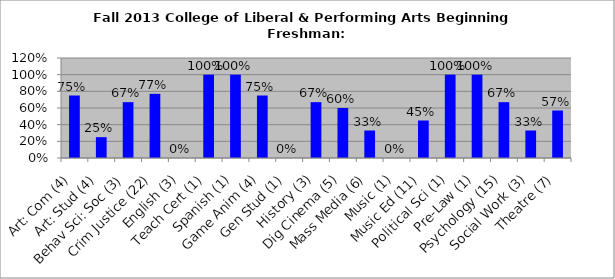
| Category | Series 0 |
|---|---|
| Art: Com (4) | 0.75 |
| Art: Stud (4) | 0.25 |
| Behav Sci: Soc (3) | 0.67 |
| Crim Justice (22) | 0.77 |
| English (3) | 0 |
| Teach Cert (1) | 1 |
| Spanish (1) | 1 |
| Game Anim (4) | 0.75 |
| Gen Stud (1) | 0 |
| History (3) | 0.67 |
| Dig Cinema (5) | 0.6 |
| Mass Media (6) | 0.33 |
| Music (1) | 0 |
| Music Ed (11) | 0.45 |
| Political Sci (1) | 1 |
| Pre-Law (1) | 1 |
| Psychology (15) | 0.67 |
| Social Work (3) | 0.33 |
| Theatre (7) | 0.57 |